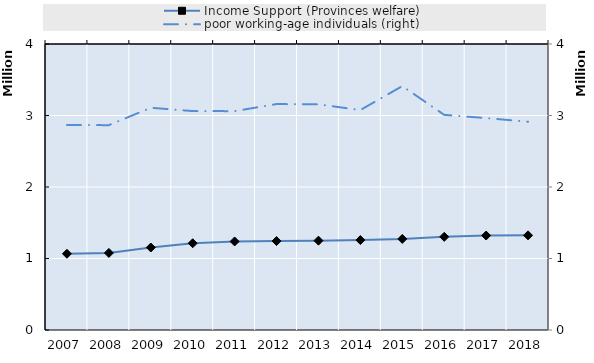
| Category | Income Support (Provinces welfare) | Survivors' pension from occupational accident insurance | 0 | Series 14 | Series 15 | Series 16 | Series 17 | Series 18 | Series 19 |
|---|---|---|---|---|---|---|---|---|---|
| 2007.0 | 1066362.571 |  |  |  |  |  |  |  |  |
| 2008.0 | 1078120.742 |  |  |  |  |  |  |  |  |
| 2009.0 | 1153793.491 |  |  |  |  |  |  |  |  |
| 2010.0 | 1213467.08 |  |  |  |  |  |  |  |  |
| 2011.0 | 1238318.18 |  |  |  |  |  |  |  |  |
| 2012.0 | 1243978.053 |  |  |  |  |  |  |  |  |
| 2013.0 | 1249530.441 |  |  |  |  |  |  |  |  |
| 2014.0 | 1258083.105 |  |  |  |  |  |  |  |  |
| 2015.0 | 1273365.266 |  |  |  |  |  |  |  |  |
| 2016.0 | 1303258.585 |  |  |  |  |  |  |  |  |
| 2017.0 | 1321233.345 |  |  |  |  |  |  |  |  |
| 2018.0 | 1323687.833 |  |  |  |  |  |  |  |  |